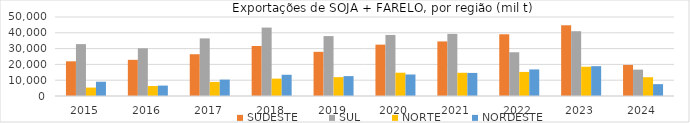
| Category | SUDESTE | SUL | NORTE | NORDESTE |
|---|---|---|---|---|
| 2015.0 | 21951.984 | 32838.329 | 5333.736 | 9026.777 |
| 2016.0 | 22892.038 | 30181.422 | 6308.76 | 6597.222 |
| 2017.0 | 26431.447 | 36449.155 | 8888.392 | 10378.808 |
| 2018.0 | 31628.825 | 43306.785 | 10974.769 | 13438.158 |
| 2019.0 | 27958.292 | 37911.569 | 11932.96 | 12588.841 |
| 2020.0 | 32512.287 | 38649.137 | 14737.499 | 13618.417 |
| 2021.0 | 34541.06 | 39304.912 | 14689.56 | 14606.019 |
| 2022.0 | 39064.867 | 27695.307 | 15229.078 | 16822.03 |
| 2023.0 | 44766.493 | 40998.891 | 18526.172 | 18879.884 |
| 2024.0 | 19658.394 | 16691.13 | 11886.158 | 7498.393 |